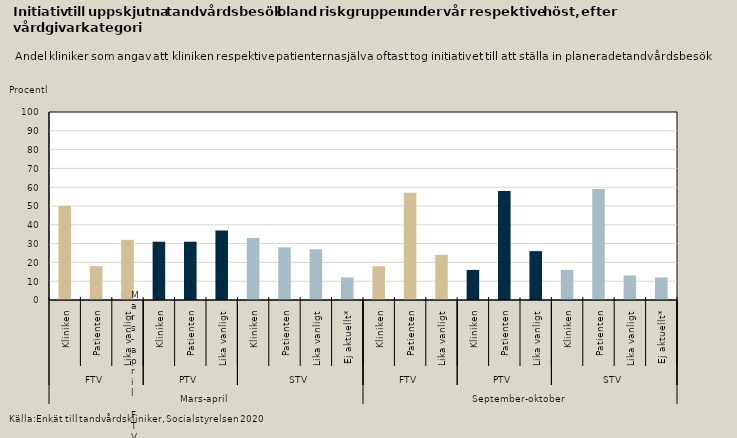
| Category | Riskgrupper |
|---|---|
| 0 | 50 |
| 1 | 18 |
| 2 | 32 |
| 3 | 31 |
| 4 | 31 |
| 5 | 37 |
| 6 | 33 |
| 7 | 28 |
| 8 | 27 |
| 9 | 12 |
| 10 | 18 |
| 11 | 57 |
| 12 | 24 |
| 13 | 16 |
| 14 | 58 |
| 15 | 26 |
| 16 | 16 |
| 17 | 59 |
| 18 | 13 |
| 19 | 12 |